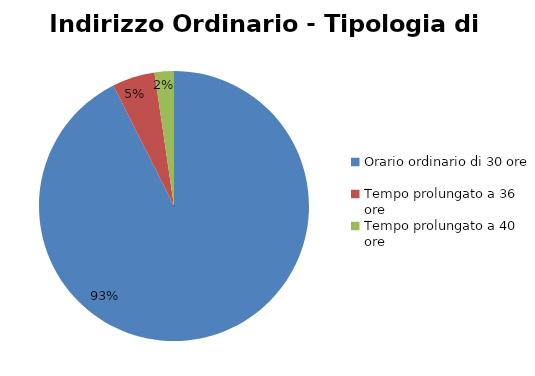
| Category | Series 0 |
|---|---|
| Orario ordinario di 30 ore | 31476 |
| Tempo prolungato a 36 ore | 1737 |
| Tempo prolungato a 40 ore | 786 |